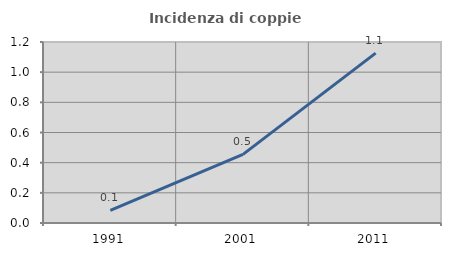
| Category | Incidenza di coppie miste |
|---|---|
| 1991.0 | 0.084 |
| 2001.0 | 0.455 |
| 2011.0 | 1.126 |